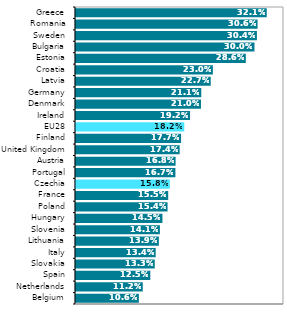
| Category | Series 0 |
|---|---|
| Belgium | 0.106 |
| Netherlands | 0.112 |
| Spain | 0.125 |
| Slovakia | 0.133 |
| Italy | 0.134 |
| Lithuania | 0.139 |
| Slovenia | 0.141 |
| Hungary | 0.145 |
| Poland | 0.154 |
| France | 0.155 |
| Czechia | 0.158 |
| Portugal | 0.167 |
| Austria | 0.168 |
| United Kingdom | 0.174 |
| Finland | 0.177 |
| EU28 | 0.182 |
| Ireland | 0.192 |
| Denmark | 0.21 |
| Germany | 0.211 |
| Latvia | 0.227 |
| Croatia | 0.23 |
| Estonia | 0.286 |
| Bulgaria | 0.3 |
| Sweden | 0.304 |
| Romania | 0.306 |
| Greece | 0.321 |